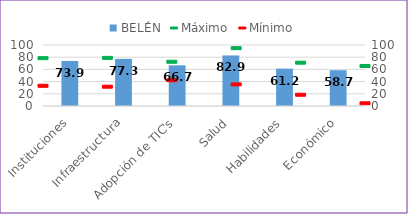
| Category | BELÉN |
|---|---|
| Instituciones | 73.861 |
| Infraestructura | 77.268 |
| Adopción de TIC's | 66.706 |
| Salud | 82.888 |
| Habilidades | 61.222 |
| Económico | 58.688 |